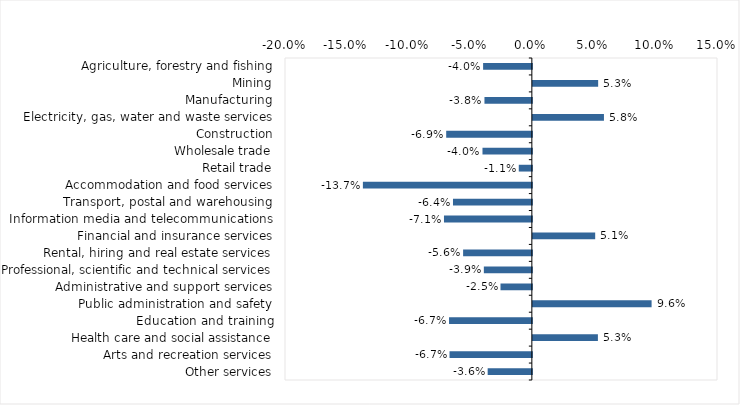
| Category | This week |
|---|---|
| Agriculture, forestry and fishing | -0.04 |
| Mining | 0.053 |
| Manufacturing | -0.038 |
| Electricity, gas, water and waste services | 0.058 |
| Construction | -0.069 |
| Wholesale trade | -0.04 |
| Retail trade | -0.011 |
| Accommodation and food services | -0.137 |
| Transport, postal and warehousing | -0.064 |
| Information media and telecommunications | -0.071 |
| Financial and insurance services | 0.05 |
| Rental, hiring and real estate services | -0.056 |
| Professional, scientific and technical services | -0.039 |
| Administrative and support services | -0.025 |
| Public administration and safety | 0.096 |
| Education and training | -0.067 |
| Health care and social assistance | 0.053 |
| Arts and recreation services | -0.067 |
| Other services | -0.036 |